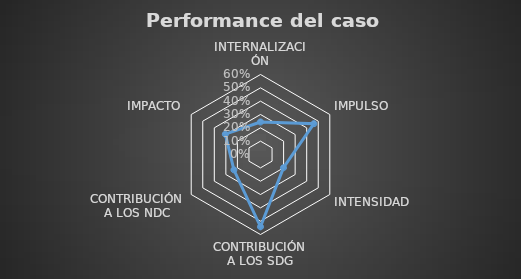
| Category | Series 0 |
|---|---|
| INTERNALIZACIÓN | 0.244 |
| IMPULSO | 0.462 |
| INTENSIDAD | 0.199 |
| CONTRIBUCIÓN A LOS SDG | 0.542 |
| CONTRIBUCIÓN A LOS NDC | 0.23 |
| IMPACTO | 0.305 |